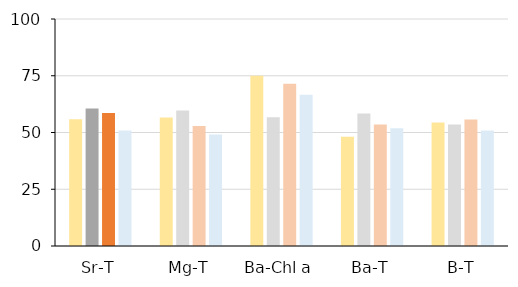
| Category | FO | IOM | ICE | GOM |
|---|---|---|---|---|
| Sr-T | 55.882 | 60.563 | 58.571 | 50.909 |
| Mg-T | 56.618 | 59.722 | 52.857 | 49.091 |
| Ba-Chl a | 75 | 56.757 | 71.429 | 66.667 |
| Ba-T | 48.148 | 58.333 | 53.571 | 51.852 |
| B-T | 54.412 | 53.521 | 55.714 | 50.909 |